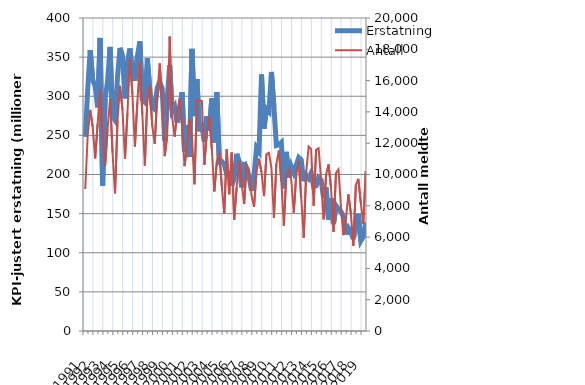
| Category | Erstatning |
|---|---|
| 1991.0 | 248.092 |
| nan | 308.671 |
| nan | 358.745 |
| nan | 321.306 |
| 1992.0 | 312.774 |
| nan | 285.788 |
| nan | 374.524 |
| nan | 185.749 |
| 1993.0 | 296.321 |
| nan | 319.274 |
| nan | 362.988 |
| nan | 274.085 |
| 1994.0 | 269.42 |
| nan | 324.408 |
| nan | 361.851 |
| nan | 351.055 |
| 1995.0 | 297.237 |
| nan | 343.848 |
| nan | 361.088 |
| nan | 330.651 |
| 1996.0 | 319.661 |
| nan | 350.914 |
| nan | 370.243 |
| nan | 296.001 |
| 1997.0 | 292.647 |
| nan | 348.559 |
| nan | 308.52 |
| nan | 285.215 |
| 1998.0 | 283.088 |
| nan | 310.543 |
| nan | 318.436 |
| nan | 309.868 |
| 1999.0 | 243.432 |
| nan | 295.38 |
| nan | 339.472 |
| nan | 281.562 |
| 2000.0 | 287.009 |
| nan | 266.167 |
| nan | 279.197 |
| nan | 305.231 |
| 2001.0 | 229.531 |
| nan | 263.263 |
| nan | 222.313 |
| nan | 360.572 |
| 2002.0 | 274.528 |
| nan | 321.851 |
| nan | 255.239 |
| nan | 264.996 |
| 2003.0 | 242.118 |
| nan | 274.35 |
| nan | 255.819 |
| nan | 297.453 |
| 2004.0 | 240.898 |
| nan | 305.383 |
| nan | 215.759 |
| nan | 216.659 |
| 2005.0 | 212.964 |
| nan | 200.714 |
| nan | 201.547 |
| nan | 185.606 |
| 2006.0 | 195.834 |
| nan | 226.468 |
| nan | 215.993 |
| nan | 183.602 |
| 2007.0 | 216.012 |
| nan | 206.349 |
| nan | 196.799 |
| nan | 179.235 |
| 2008.0 | 199.136 |
| nan | 234.144 |
| nan | 229.465 |
| nan | 327.804 |
| 2009.0 | 258.606 |
| nan | 283.823 |
| nan | 280.27 |
| nan | 331.029 |
| 2010.0 | 286.396 |
| nan | 237.137 |
| nan | 238.11 |
| nan | 240.949 |
| 2011.0 | 182.249 |
| nan | 228.937 |
| nan | 196.03 |
| nan | 210.415 |
| 2012.0 | 202.321 |
| nan | 212.072 |
| nan | 221.634 |
| nan | 218.723 |
| 2013.0 | 191.349 |
| nan | 198.889 |
| nan | 194.801 |
| nan | 201.826 |
| 2014.0 | 184.405 |
| nan | 185.585 |
| nan | 195.926 |
| nan | 192.876 |
| 2015.0 | 170.213 |
| nan | 183.394 |
| nan | 142.356 |
| nan | 169.66 |
| 2016.0 | 136.633 |
| nan | 160.358 |
| nan | 155.641 |
| nan | 152.825 |
| 2017.0 | 146.184 |
| nan | 123.382 |
| nan | 131.755 |
| nan | 126.692 |
| 2018.0 | 117.489 |
| nan | 136.357 |
| nan | 149.602 |
| nan | 115.031 |
| 2019.0 | 120.47 |
| nan | 138.809 |